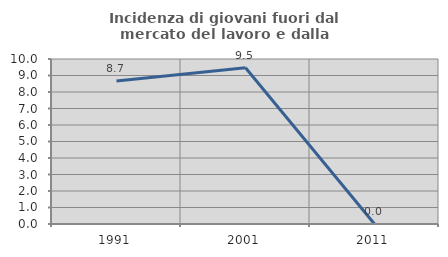
| Category | Incidenza di giovani fuori dal mercato del lavoro e dalla formazione  |
|---|---|
| 1991.0 | 8.661 |
| 2001.0 | 9.474 |
| 2011.0 | 0 |